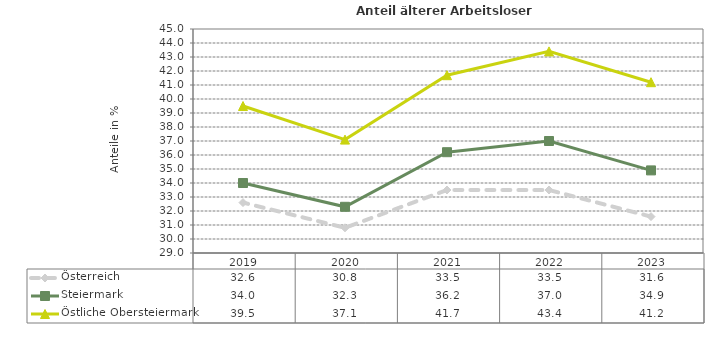
| Category | Österreich | Steiermark | Östliche Obersteiermark |
|---|---|---|---|
| 2023.0 | 31.6 | 34.9 | 41.2 |
| 2022.0 | 33.5 | 37 | 43.4 |
| 2021.0 | 33.5 | 36.2 | 41.7 |
| 2020.0 | 30.8 | 32.3 | 37.1 |
| 2019.0 | 32.6 | 34 | 39.5 |